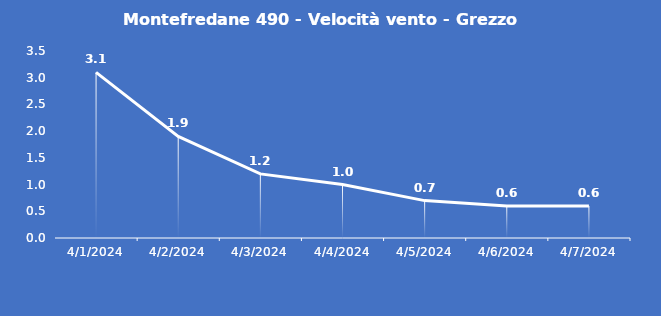
| Category | Montefredane 490 - Velocità vento - Grezzo (m/s) |
|---|---|
| 4/1/24 | 3.1 |
| 4/2/24 | 1.9 |
| 4/3/24 | 1.2 |
| 4/4/24 | 1 |
| 4/5/24 | 0.7 |
| 4/6/24 | 0.6 |
| 4/7/24 | 0.6 |